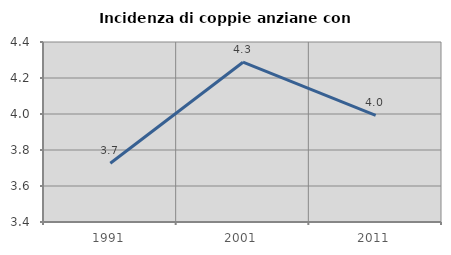
| Category | Incidenza di coppie anziane con figli |
|---|---|
| 1991.0 | 3.726 |
| 2001.0 | 4.288 |
| 2011.0 | 3.992 |